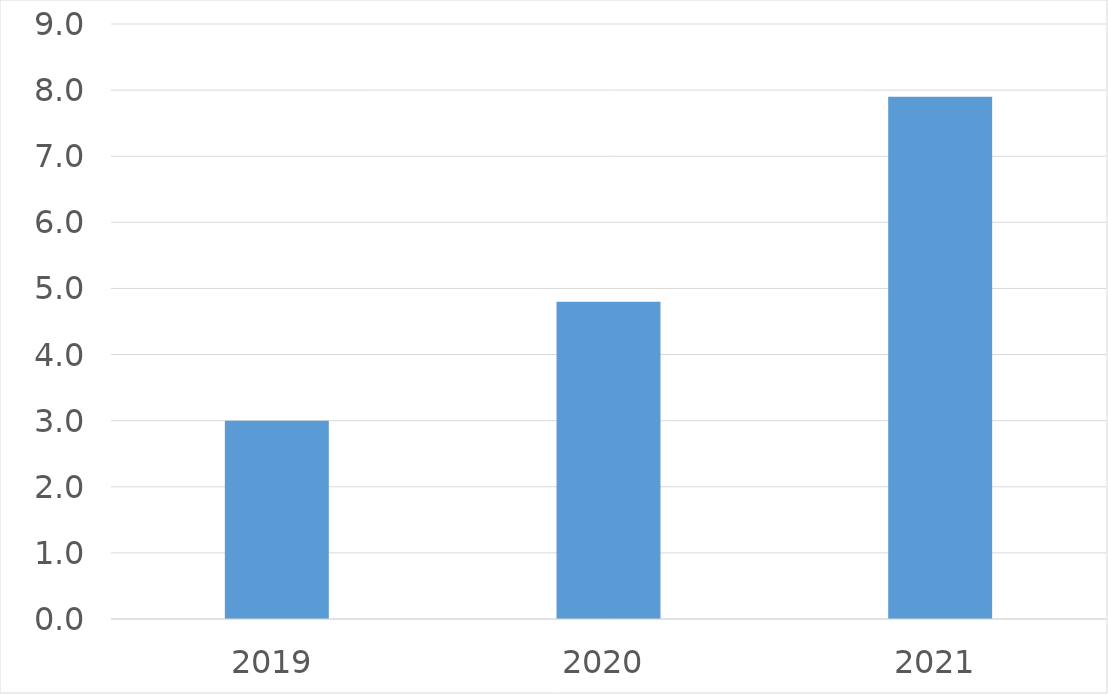
| Category | Series 0 |
|---|---|
| 2019 | 3 |
| 2020 | 4.8 |
| 2021 | 7.9 |